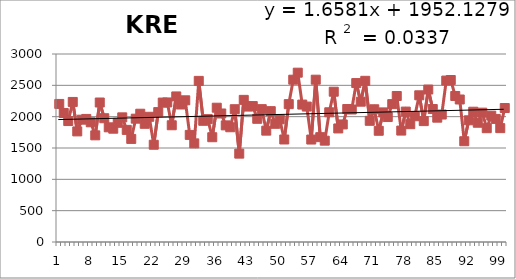
| Category | 1913-2012 |
|---|---|
| 0 | 2203 |
| 1 | 2059 |
| 2 | 1930 |
| 3 | 2235 |
| 4 | 1765 |
| 5 | 1952 |
| 6 | 1964 |
| 7 | 1910 |
| 8 | 1702 |
| 9 | 2226 |
| 10 | 1975 |
| 11 | 1830 |
| 12 | 1808 |
| 13 | 1902 |
| 14 | 1989 |
| 15 | 1789 |
| 16 | 1645 |
| 17 | 1968 |
| 18 | 2047 |
| 19 | 1886 |
| 20 | 1998 |
| 21 | 1552 |
| 22 | 2073 |
| 23 | 2225 |
| 24 | 2227 |
| 25 | 1863 |
| 26 | 2323 |
| 27 | 2194 |
| 28 | 2261 |
| 29 | 1709 |
| 30 | 1574 |
| 31 | 2571 |
| 32 | 1934 |
| 33 | 1961 |
| 34 | 1672 |
| 35 | 2143 |
| 36 | 2051 |
| 37 | 1861 |
| 38 | 1831 |
| 39 | 2119 |
| 40 | 1410 |
| 41 | 2268 |
| 42 | 2161 |
| 43 | 2169 |
| 44 | 1966 |
| 45 | 2120 |
| 46 | 1777 |
| 47 | 2088 |
| 48 | 1886 |
| 49 | 1958 |
| 50 | 1636 |
| 51 | 2200 |
| 52 | 2590 |
| 53 | 2702 |
| 54 | 2193 |
| 55 | 2161 |
| 56 | 1635 |
| 57 | 2590 |
| 58 | 1673 |
| 59 | 1617 |
| 60 | 2070 |
| 61 | 2398 |
| 62 | 1812 |
| 63 | 1876 |
| 64 | 2122 |
| 65 | 2114 |
| 66 | 2536 |
| 67 | 2239 |
| 68 | 2572 |
| 69 | 1934 |
| 70 | 2118 |
| 71 | 1775 |
| 72 | 2068 |
| 73 | 1994 |
| 74 | 2200 |
| 75 | 2330 |
| 76 | 1778 |
| 77 | 2081 |
| 78 | 1880 |
| 79 | 2007 |
| 80 | 2341 |
| 81 | 1929 |
| 82 | 2433 |
| 83 | 2122 |
| 84 | 1984 |
| 85 | 2034 |
| 86 | 2576 |
| 87 | 2585 |
| 88 | 2330 |
| 89 | 2274 |
| 90 | 1608 |
| 91 | 1942 |
| 92 | 2079 |
| 93 | 1903 |
| 94 | 2064 |
| 95 | 1816 |
| 96 | 2016 |
| 97 | 1964 |
| 98 | 1817 |
| 99 | 2138 |